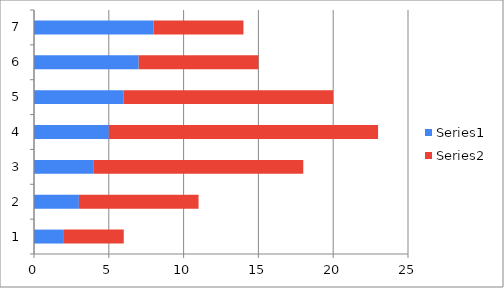
| Category | Series 0 | Series 1 |
|---|---|---|
| 0 | 2 | 4 |
| 1 | 3 | 8 |
| 2 | 4 | 14 |
| 3 | 5 | 18 |
| 4 | 6 | 14 |
| 5 | 7 | 8 |
| 6 | 8 | 6 |